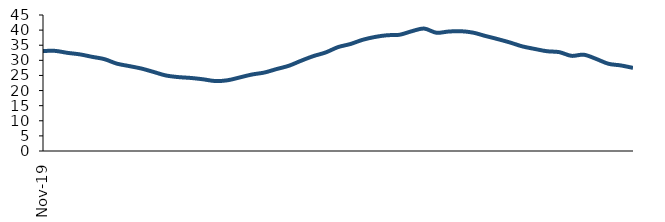
| Category | Series 0 |
|---|---|
| 2019-11-01 | 33.082 |
| 2019-12-01 | 33.123 |
| 2020-01-01 | 32.469 |
| 2020-02-01 | 31.976 |
| 2020-03-01 | 31.156 |
| 2020-04-01 | 30.392 |
| 2020-05-01 | 28.913 |
| 2020-06-01 | 28.108 |
| 2020-07-01 | 27.29 |
| 2020-08-01 | 26.155 |
| 2020-09-01 | 24.984 |
| 2020-10-01 | 24.457 |
| 2020-11-01 | 24.181 |
| 2020-12-01 | 23.74 |
| 2021-01-01 | 23.158 |
| 2021-02-01 | 23.396 |
| 2021-03-01 | 24.331 |
| 2021-04-01 | 25.306 |
| 2021-05-01 | 25.953 |
| 2021-06-01 | 27.111 |
| 2021-07-01 | 28.2 |
| 2021-08-01 | 29.868 |
| 2021-09-01 | 31.404 |
| 2021-10-01 | 32.611 |
| 2021-11-01 | 34.373 |
| 2021-12-01 | 35.387 |
| 2022-01-01 | 36.784 |
| 2022-02-01 | 37.727 |
| 2022-03-01 | 38.303 |
| 2022-04-01 | 38.455 |
| 2022-05-01 | 39.626 |
| 2022-06-01 | 40.515 |
| 2022-07-01 | 39.14 |
| 2022-08-01 | 39.529 |
| 2022-09-01 | 39.638 |
| 2022-10-01 | 39.158 |
| 2022-11-01 | 38.048 |
| 2022-12-01 | 37.019 |
| 2023-01-01 | 35.89 |
| 2023-02-01 | 34.611 |
| 2023-03-01 | 33.773 |
| 2023-04-01 | 33.011 |
| 2023-05-01 | 32.711 |
| 2023-06-01 | 31.485 |
| 2023-07-01 | 31.855 |
| 2023-08-01 | 30.473 |
| 2023-09-01 | 28.864 |
| 2023-10-01 | 28.318 |
| 2023-11-01 | 27.504 |